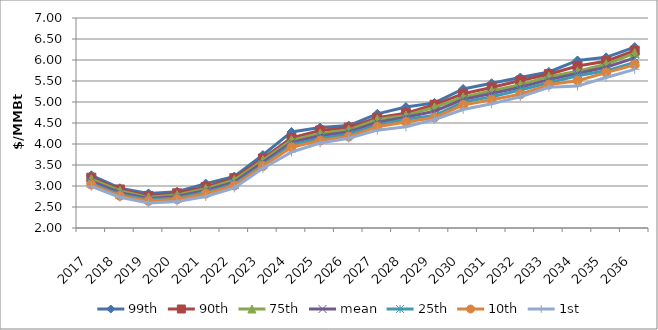
| Category | 99th | 90th | 75th | mean | 25th | 10th | 1st |
|---|---|---|---|---|---|---|---|
| 2017.0 | 3.255 | 3.198 | 3.162 | 3.113 | 3.064 | 3.033 | 2.99 |
| 2018.0 | 2.947 | 2.917 | 2.889 | 2.84 | 2.796 | 2.765 | 2.732 |
| 2019.0 | 2.823 | 2.764 | 2.73 | 2.705 | 2.676 | 2.645 | 2.594 |
| 2020.0 | 2.864 | 2.826 | 2.784 | 2.751 | 2.715 | 2.682 | 2.634 |
| 2021.0 | 3.057 | 2.977 | 2.936 | 2.896 | 2.851 | 2.817 | 2.752 |
| 2022.0 | 3.226 | 3.185 | 3.144 | 3.09 | 3.041 | 3.01 | 2.957 |
| 2023.0 | 3.737 | 3.655 | 3.615 | 3.565 | 3.508 | 3.475 | 3.423 |
| 2024.0 | 4.287 | 4.146 | 4.094 | 4.038 | 3.978 | 3.923 | 3.807 |
| 2025.0 | 4.392 | 4.322 | 4.251 | 4.197 | 4.129 | 4.081 | 4.022 |
| 2026.0 | 4.438 | 4.39 | 4.338 | 4.285 | 4.233 | 4.177 | 4.137 |
| 2027.0 | 4.718 | 4.626 | 4.587 | 4.517 | 4.455 | 4.413 | 4.329 |
| 2028.0 | 4.88 | 4.736 | 4.681 | 4.636 | 4.591 | 4.524 | 4.41 |
| 2029.0 | 4.978 | 4.934 | 4.874 | 4.78 | 4.677 | 4.631 | 4.584 |
| 2030.0 | 5.311 | 5.198 | 5.113 | 5.06 | 4.998 | 4.928 | 4.822 |
| 2031.0 | 5.445 | 5.347 | 5.271 | 5.201 | 5.124 | 5.053 | 4.959 |
| 2032.0 | 5.583 | 5.511 | 5.413 | 5.35 | 5.286 | 5.184 | 5.122 |
| 2033.0 | 5.715 | 5.662 | 5.603 | 5.533 | 5.458 | 5.414 | 5.35 |
| 2034.0 | 5.989 | 5.856 | 5.73 | 5.679 | 5.624 | 5.508 | 5.378 |
| 2035.0 | 6.064 | 5.97 | 5.898 | 5.827 | 5.742 | 5.7 | 5.583 |
| 2036.0 | 6.308 | 6.22 | 6.165 | 6.05 | 5.94 | 5.886 | 5.777 |